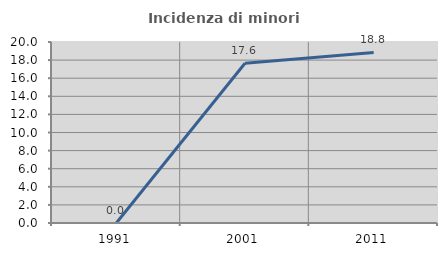
| Category | Incidenza di minori stranieri |
|---|---|
| 1991.0 | 0 |
| 2001.0 | 17.647 |
| 2011.0 | 18.841 |